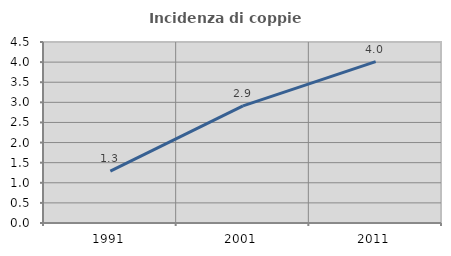
| Category | Incidenza di coppie miste |
|---|---|
| 1991.0 | 1.292 |
| 2001.0 | 2.911 |
| 2011.0 | 4.011 |